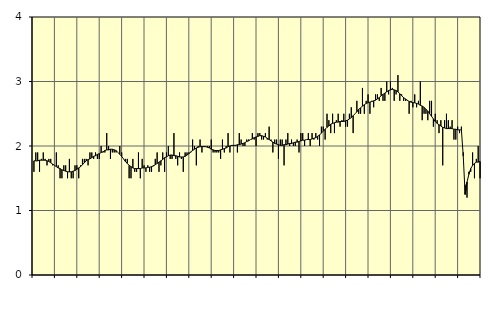
| Category | Hotell och restaurang, SNI 55-56 | Series 1 |
|---|---|---|
| nan | 1.6 | 1.77 |
| 1.0 | 1.9 | 1.77 |
| 1.0 | 1.9 | 1.77 |
| 1.0 | 1.6 | 1.78 |
| 1.0 | 1.8 | 1.78 |
| 1.0 | 1.9 | 1.78 |
| 1.0 | 1.8 | 1.78 |
| 1.0 | 1.7 | 1.77 |
| 1.0 | 1.8 | 1.76 |
| 1.0 | 1.8 | 1.74 |
| 1.0 | 1.7 | 1.72 |
| 1.0 | 1.7 | 1.7 |
| nan | 1.9 | 1.68 |
| 2.0 | 1.7 | 1.66 |
| 2.0 | 1.5 | 1.65 |
| 2.0 | 1.5 | 1.63 |
| 2.0 | 1.7 | 1.62 |
| 2.0 | 1.7 | 1.61 |
| 2.0 | 1.5 | 1.6 |
| 2.0 | 1.8 | 1.6 |
| 2.0 | 1.5 | 1.6 |
| 2.0 | 1.5 | 1.61 |
| 2.0 | 1.7 | 1.62 |
| 2.0 | 1.7 | 1.64 |
| nan | 1.5 | 1.66 |
| 3.0 | 1.7 | 1.68 |
| 3.0 | 1.8 | 1.71 |
| 3.0 | 1.8 | 1.74 |
| 3.0 | 1.8 | 1.77 |
| 3.0 | 1.7 | 1.79 |
| 3.0 | 1.9 | 1.8 |
| 3.0 | 1.9 | 1.82 |
| 3.0 | 1.8 | 1.84 |
| 3.0 | 1.9 | 1.85 |
| 3.0 | 1.8 | 1.87 |
| 3.0 | 1.8 | 1.88 |
| nan | 2 | 1.9 |
| 4.0 | 1.9 | 1.91 |
| 4.0 | 1.9 | 1.93 |
| 4.0 | 2.2 | 1.94 |
| 4.0 | 2 | 1.94 |
| 4.0 | 1.8 | 1.95 |
| 4.0 | 1.9 | 1.95 |
| 4.0 | 1.9 | 1.94 |
| 4.0 | 1.9 | 1.93 |
| 4.0 | 1.9 | 1.9 |
| 4.0 | 2 | 1.87 |
| 4.0 | 1.9 | 1.84 |
| nan | 1.8 | 1.8 |
| 5.0 | 1.8 | 1.76 |
| 5.0 | 1.8 | 1.73 |
| 5.0 | 1.5 | 1.7 |
| 5.0 | 1.5 | 1.68 |
| 5.0 | 1.8 | 1.66 |
| 5.0 | 1.6 | 1.65 |
| 5.0 | 1.6 | 1.65 |
| 5.0 | 1.9 | 1.65 |
| 5.0 | 1.5 | 1.65 |
| 5.0 | 1.8 | 1.66 |
| 5.0 | 1.7 | 1.66 |
| nan | 1.6 | 1.66 |
| 6.0 | 1.7 | 1.67 |
| 6.0 | 1.6 | 1.67 |
| 6.0 | 1.6 | 1.68 |
| 6.0 | 1.7 | 1.69 |
| 6.0 | 1.8 | 1.71 |
| 6.0 | 1.9 | 1.73 |
| 6.0 | 1.6 | 1.75 |
| 6.0 | 1.7 | 1.77 |
| 6.0 | 1.9 | 1.79 |
| 6.0 | 1.6 | 1.82 |
| 6.0 | 1.9 | 1.83 |
| nan | 2 | 1.85 |
| 7.0 | 1.8 | 1.86 |
| 7.0 | 1.8 | 1.86 |
| 7.0 | 2.2 | 1.85 |
| 7.0 | 1.8 | 1.85 |
| 7.0 | 1.7 | 1.84 |
| 7.0 | 1.9 | 1.83 |
| 7.0 | 1.8 | 1.83 |
| 7.0 | 1.6 | 1.83 |
| 7.0 | 1.9 | 1.84 |
| 7.0 | 1.9 | 1.86 |
| 7.0 | 1.9 | 1.88 |
| nan | 1.9 | 1.91 |
| 8.0 | 2.1 | 1.93 |
| 8.0 | 2 | 1.95 |
| 8.0 | 1.7 | 1.97 |
| 8.0 | 2 | 1.98 |
| 8.0 | 2.1 | 1.99 |
| 8.0 | 1.9 | 1.99 |
| 8.0 | 2 | 1.99 |
| 8.0 | 2 | 1.99 |
| 8.0 | 2 | 1.98 |
| 8.0 | 2 | 1.97 |
| 8.0 | 2.1 | 1.95 |
| nan | 1.9 | 1.94 |
| 9.0 | 1.9 | 1.93 |
| 9.0 | 1.9 | 1.93 |
| 9.0 | 1.9 | 1.93 |
| 9.0 | 1.8 | 1.94 |
| 9.0 | 2.1 | 1.95 |
| 9.0 | 1.9 | 1.96 |
| 9.0 | 2 | 1.97 |
| 9.0 | 2.2 | 1.99 |
| 9.0 | 1.9 | 2 |
| 9.0 | 2 | 2.01 |
| 9.0 | 2 | 2.01 |
| nan | 2 | 2.01 |
| 10.0 | 1.9 | 2.02 |
| 10.0 | 2.2 | 2.02 |
| 10.0 | 2.1 | 2.03 |
| 10.0 | 2 | 2.04 |
| 10.0 | 2 | 2.05 |
| 10.0 | 2.1 | 2.07 |
| 10.0 | 2.1 | 2.08 |
| 10.0 | 2.1 | 2.1 |
| 10.0 | 2.2 | 2.11 |
| 10.0 | 2.1 | 2.13 |
| 10.0 | 2 | 2.14 |
| nan | 2.2 | 2.15 |
| 11.0 | 2.2 | 2.16 |
| 11.0 | 2.1 | 2.16 |
| 11.0 | 2.1 | 2.15 |
| 11.0 | 2.2 | 2.14 |
| 11.0 | 2.1 | 2.12 |
| 11.0 | 2.3 | 2.1 |
| 11.0 | 2.1 | 2.08 |
| 11.0 | 1.9 | 2.06 |
| 11.0 | 2.1 | 2.04 |
| 11.0 | 2.1 | 2.03 |
| 11.0 | 1.8 | 2.02 |
| nan | 2.1 | 2.01 |
| 12.0 | 2.1 | 2.01 |
| 12.0 | 1.7 | 2.02 |
| 12.0 | 2.1 | 2.02 |
| 12.0 | 2.2 | 2.03 |
| 12.0 | 2 | 2.04 |
| 12.0 | 2.1 | 2.04 |
| 12.0 | 2 | 2.05 |
| 12.0 | 2 | 2.06 |
| 12.0 | 2.1 | 2.06 |
| 12.0 | 1.9 | 2.07 |
| 12.0 | 2.2 | 2.08 |
| nan | 2.2 | 2.09 |
| 13.0 | 2 | 2.09 |
| 13.0 | 2.1 | 2.1 |
| 13.0 | 2.2 | 2.1 |
| 13.0 | 2 | 2.1 |
| 13.0 | 2.2 | 2.11 |
| 13.0 | 2.1 | 2.12 |
| 13.0 | 2.2 | 2.13 |
| 13.0 | 2.1 | 2.15 |
| 13.0 | 2 | 2.17 |
| 13.0 | 2.3 | 2.2 |
| 13.0 | 2.3 | 2.23 |
| nan | 2.1 | 2.26 |
| 14.0 | 2.5 | 2.29 |
| 14.0 | 2.4 | 2.31 |
| 14.0 | 2.2 | 2.34 |
| 14.0 | 2.5 | 2.35 |
| 14.0 | 2.2 | 2.36 |
| 14.0 | 2.4 | 2.37 |
| 14.0 | 2.5 | 2.37 |
| 14.0 | 2.3 | 2.38 |
| 14.0 | 2.4 | 2.38 |
| 14.0 | 2.5 | 2.38 |
| 14.0 | 2.3 | 2.39 |
| nan | 2.3 | 2.4 |
| 15.0 | 2.5 | 2.42 |
| 15.0 | 2.6 | 2.44 |
| 15.0 | 2.2 | 2.47 |
| 15.0 | 2.5 | 2.5 |
| 15.0 | 2.7 | 2.53 |
| 15.0 | 2.5 | 2.57 |
| 15.0 | 2.5 | 2.59 |
| 15.0 | 2.9 | 2.62 |
| 15.0 | 2.5 | 2.64 |
| 15.0 | 2.7 | 2.66 |
| 15.0 | 2.8 | 2.67 |
| nan | 2.5 | 2.68 |
| 16.0 | 2.7 | 2.69 |
| 16.0 | 2.6 | 2.7 |
| 16.0 | 2.8 | 2.71 |
| 16.0 | 2.8 | 2.73 |
| 16.0 | 2.7 | 2.75 |
| 16.0 | 2.9 | 2.78 |
| 16.0 | 2.7 | 2.8 |
| 16.0 | 2.7 | 2.82 |
| 16.0 | 3 | 2.84 |
| 16.0 | 2.8 | 2.86 |
| 16.0 | 3 | 2.87 |
| nan | 2.9 | 2.88 |
| 17.0 | 2.7 | 2.87 |
| 17.0 | 2.8 | 2.86 |
| 17.0 | 3.1 | 2.84 |
| 17.0 | 2.7 | 2.81 |
| 17.0 | 2.8 | 2.78 |
| 17.0 | 2.7 | 2.75 |
| 17.0 | 2.7 | 2.73 |
| 17.0 | 2.7 | 2.71 |
| 17.0 | 2.5 | 2.69 |
| 17.0 | 2.7 | 2.68 |
| 17.0 | 2.6 | 2.67 |
| nan | 2.8 | 2.67 |
| 18.0 | 2.6 | 2.66 |
| 18.0 | 2.7 | 2.65 |
| 18.0 | 3 | 2.63 |
| 18.0 | 2.4 | 2.62 |
| 18.0 | 2.5 | 2.6 |
| 18.0 | 2.5 | 2.57 |
| 18.0 | 2.4 | 2.54 |
| 18.0 | 2.7 | 2.5 |
| 18.0 | 2.7 | 2.46 |
| 18.0 | 2.3 | 2.42 |
| 18.0 | 2.5 | 2.38 |
| nan | 2.4 | 2.35 |
| 19.0 | 2.2 | 2.33 |
| 19.0 | 2.4 | 2.31 |
| 19.0 | 1.7 | 2.29 |
| 19.0 | 2.4 | 2.28 |
| 19.0 | 2.5 | 2.27 |
| 19.0 | 2.4 | 2.27 |
| 19.0 | 2.3 | 2.27 |
| 19.0 | 2.4 | 2.27 |
| 19.0 | 2.1 | 2.26 |
| 19.0 | 2.1 | 2.26 |
| 19.0 | 2.3 | 2.25 |
| nan | 2.2 | 2.25 |
| 20.0 | 2.3 | 2.25 |
| 20.0 | 1.9 | 1.84 |
| 20.0 | 1.4 | 1.25 |
| 20.0 | 1.2 | 1.44 |
| 20.0 | 1.6 | 1.56 |
| 20.0 | 1.6 | 1.65 |
| 20.0 | 1.9 | 1.7 |
| 20.0 | 1.5 | 1.73 |
| 20.0 | 1.8 | 1.75 |
| 20.0 | 2 | 1.75 |
| 20.0 | 1.5 | 1.76 |